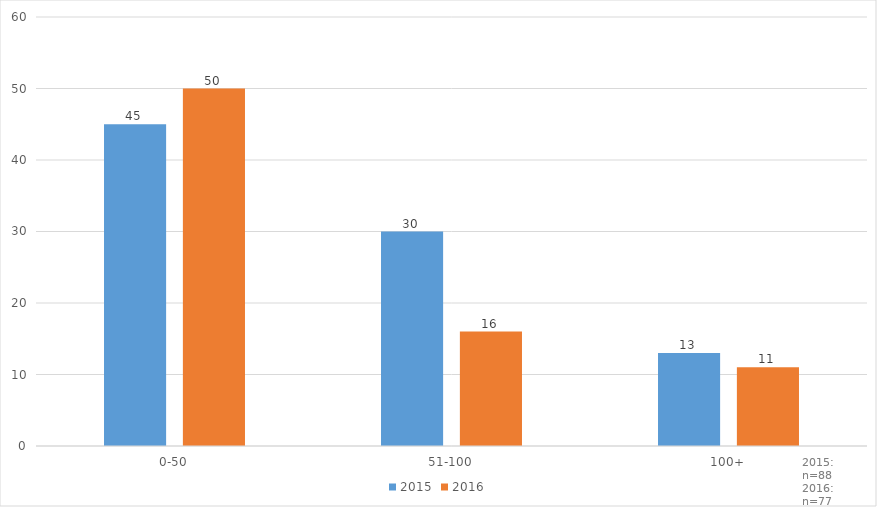
| Category | 2015 | 2016 |
|---|---|---|
| 0-50 | 45 | 50 |
| 51-100 | 30 | 16 |
| 100+ | 13 | 11 |